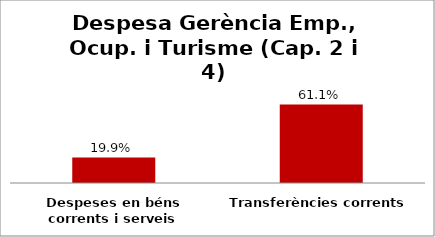
| Category | Series 0 |
|---|---|
| Despeses en béns corrents i serveis | 0.199 |
| Transferències corrents | 0.611 |